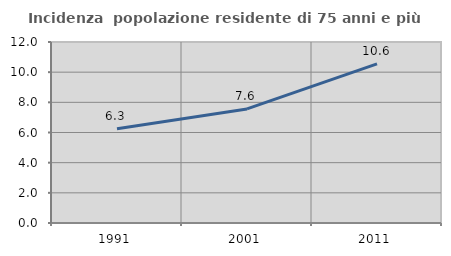
| Category | Incidenza  popolazione residente di 75 anni e più |
|---|---|
| 1991.0 | 6.25 |
| 2001.0 | 7.562 |
| 2011.0 | 10.55 |